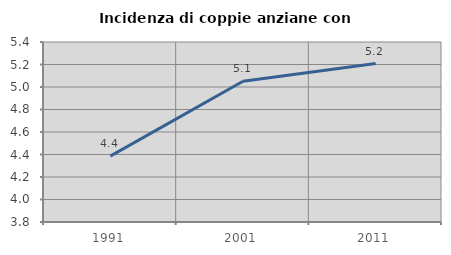
| Category | Incidenza di coppie anziane con figli |
|---|---|
| 1991.0 | 4.386 |
| 2001.0 | 5.051 |
| 2011.0 | 5.208 |